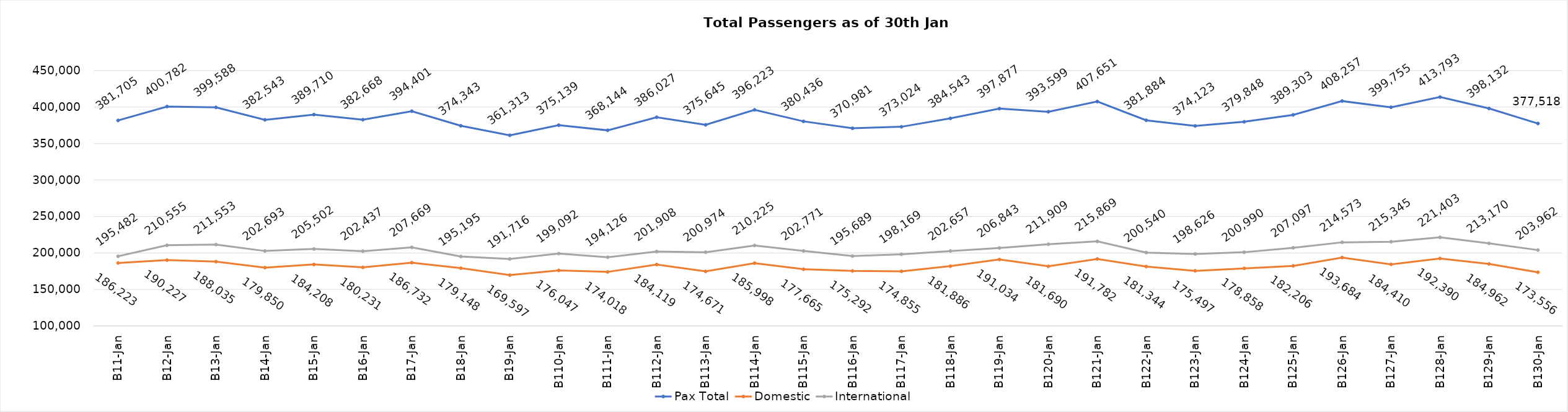
| Category | Pax Total | Domestic | International |
|---|---|---|---|
| 2024-01-01 | 381705 | 186223 | 195482 |
| 2024-01-02 | 400782 | 190227 | 210555 |
| 2024-01-03 | 399588 | 188035 | 211553 |
| 2024-01-04 | 382543 | 179850 | 202693 |
| 2024-01-05 | 389710 | 184208 | 205502 |
| 2024-01-06 | 382668 | 180231 | 202437 |
| 2024-01-07 | 394401 | 186732 | 207669 |
| 2024-01-08 | 374343 | 179148 | 195195 |
| 2024-01-09 | 361313 | 169597 | 191716 |
| 2024-01-10 | 375139 | 176047 | 199092 |
| 2024-01-11 | 368144 | 174018 | 194126 |
| 2024-01-12 | 386027 | 184119 | 201908 |
| 2024-01-13 | 375645 | 174671 | 200974 |
| 2024-01-14 | 396223 | 185998 | 210225 |
| 2024-01-15 | 380436 | 177665 | 202771 |
| 2024-01-16 | 370981 | 175292 | 195689 |
| 2024-01-17 | 373024 | 174855 | 198169 |
| 2024-01-18 | 384543 | 181886 | 202657 |
| 2024-01-19 | 397877 | 191034 | 206843 |
| 2024-01-20 | 393599 | 181690 | 211909 |
| 2024-01-21 | 407651 | 191782 | 215869 |
| 2024-01-22 | 381884 | 181344 | 200540 |
| 2024-01-23 | 374123 | 175497 | 198626 |
| 2024-01-24 | 379848 | 178858 | 200990 |
| 2024-01-25 | 389303 | 182206 | 207097 |
| 2024-01-26 | 408257 | 193684 | 214573 |
| 2024-01-27 | 399755 | 184410 | 215345 |
| 2024-01-28 | 413793 | 192390 | 221403 |
| 2024-01-29 | 398132 | 184962 | 213170 |
| 2024-01-30 | 377518 | 173556 | 203962 |